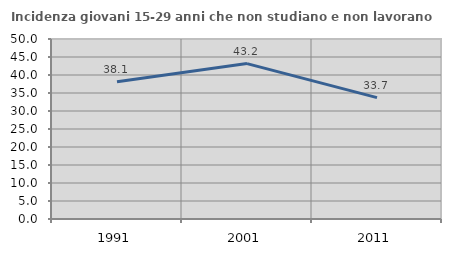
| Category | Incidenza giovani 15-29 anni che non studiano e non lavorano  |
|---|---|
| 1991.0 | 38.095 |
| 2001.0 | 43.172 |
| 2011.0 | 33.715 |